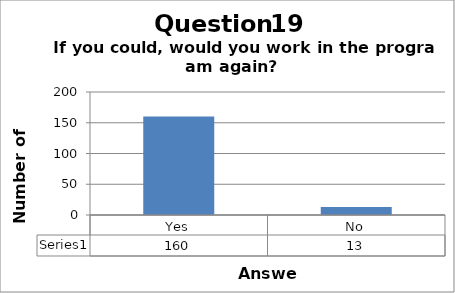
| Category | Series 0 |
|---|---|
| Yes | 160 |
| No | 13 |